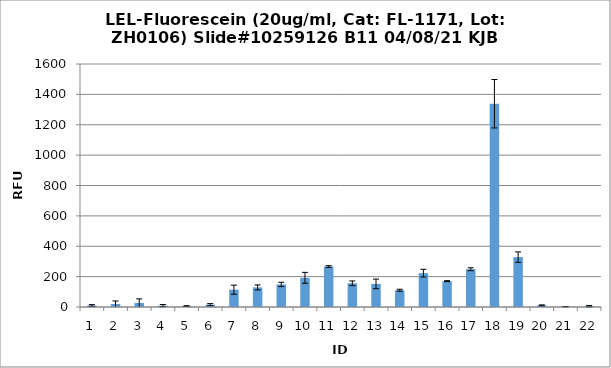
| Category | Series 0 |
|---|---|
| 0 | 10 |
| 1 | 19.75 |
| 2 | 26.75 |
| 3 | 9 |
| 4 | 6.5 |
| 5 | 15.5 |
| 6 | 114 |
| 7 | 129 |
| 8 | 148.5 |
| 9 | 192.25 |
| 10 | 266.5 |
| 11 | 156.25 |
| 12 | 152 |
| 13 | 110.5 |
| 14 | 223 |
| 15 | 170.25 |
| 16 | 248.75 |
| 17 | 1338.5 |
| 18 | 328.5 |
| 19 | 10.75 |
| 20 | 2.25 |
| 21 | 5.25 |